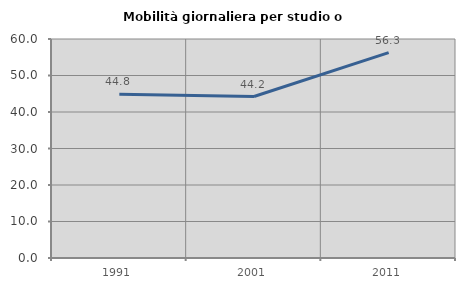
| Category | Mobilità giornaliera per studio o lavoro |
|---|---|
| 1991.0 | 44.837 |
| 2001.0 | 44.246 |
| 2011.0 | 56.272 |